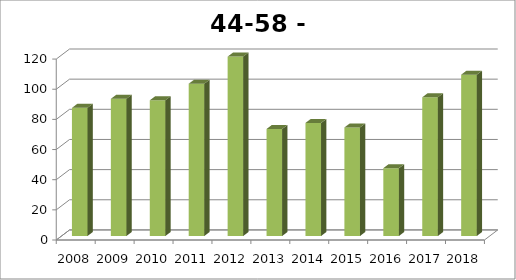
| Category | Series 0 |
|---|---|
| 2008.0 | 85 |
| 2009.0 | 91 |
| 2010.0 | 90 |
| 2011.0 | 101 |
| 2012.0 | 119 |
| 2013.0 | 71 |
| 2014.0 | 75 |
| 2015.0 | 72 |
| 2016.0 | 45 |
| 2017.0 | 92 |
| 2018.0 | 107 |